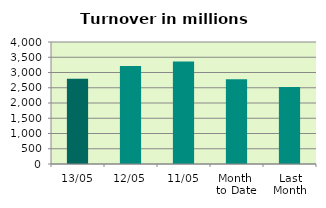
| Category | Series 0 |
|---|---|
| 13/05 | 2795.733 |
| 12/05 | 3214.293 |
| 11/05 | 3364.099 |
| Month 
to Date | 2781.607 |
| Last
Month | 2525.558 |